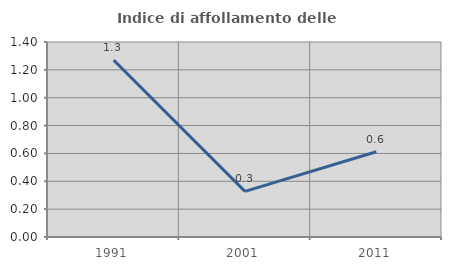
| Category | Indice di affollamento delle abitazioni  |
|---|---|
| 1991.0 | 1.27 |
| 2001.0 | 0.328 |
| 2011.0 | 0.612 |